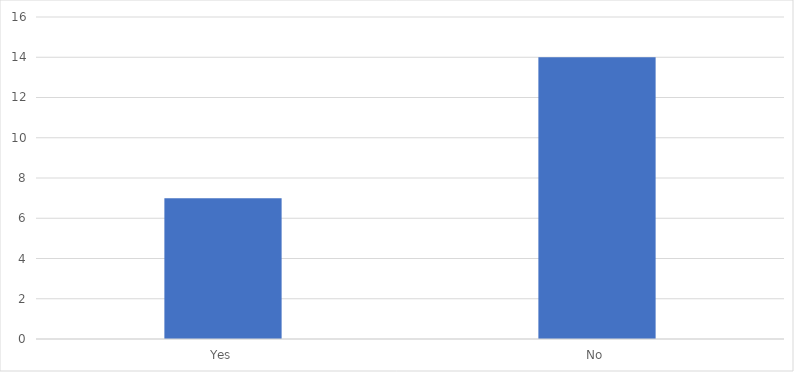
| Category | Number of Responses |
|---|---|
| Yes | 7 |
| No | 14 |